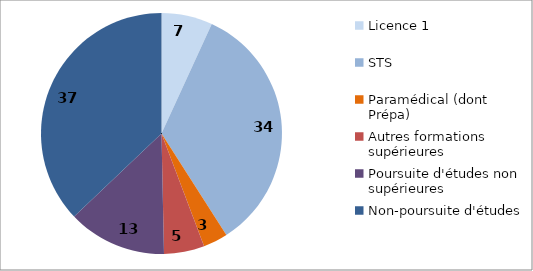
| Category | Bacheliers professionnels |
|---|---|
| Licence 1 | 6.85 |
| STS | 34.1 |
| Paramédical (dont Prépa) | 3.3 |
| Autres formations supérieures | 5.42 |
| Poursuite d'études non supérieures | 13.24 |
| Non-poursuite d'études | 37.09 |